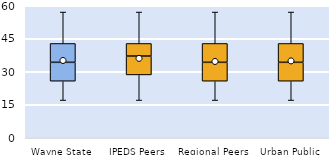
| Category | 25th | 50th | 75th |
|---|---|---|---|
| Wayne State | 25.714 | 8.571 | 8.571 |
| IPEDS Peers | 28.571 | 8.571 | 5.714 |
| Regional Peers | 25.714 | 8.571 | 8.571 |
| Urban Public | 25.714 | 8.571 | 8.571 |